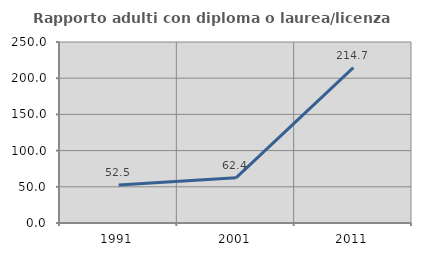
| Category | Rapporto adulti con diploma o laurea/licenza media  |
|---|---|
| 1991.0 | 52.5 |
| 2001.0 | 62.439 |
| 2011.0 | 214.716 |